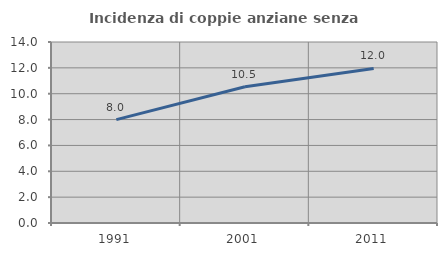
| Category | Incidenza di coppie anziane senza figli  |
|---|---|
| 1991.0 | 7.999 |
| 2001.0 | 10.535 |
| 2011.0 | 11.957 |